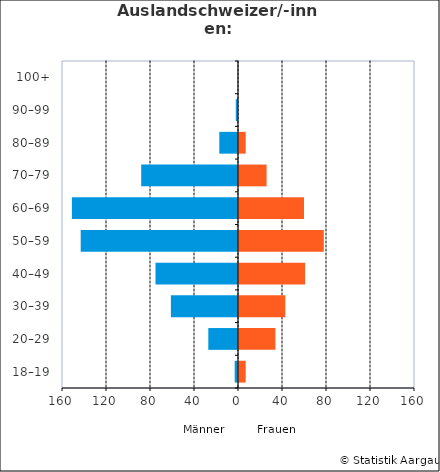
| Category | Männer | Frauen |
|---|---|---|
| 18–19 | -3 | 7 |
| 20–29 | -27 | 34 |
| 30–39 | -61 | 43 |
| 40–49 | -75 | 61 |
| 50–59 | -143 | 78 |
| 60–69 | -151 | 60 |
| 70–79 | -88 | 26 |
| 80–89 | -17 | 7 |
| 90–99 | -2 | 0 |
| 100+ | 0 | 0 |